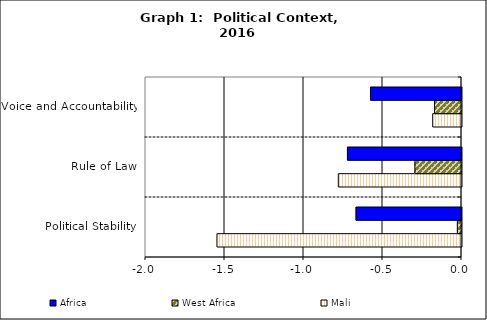
| Category | Mali | West Africa | Africa |
|---|---|---|---|
| Political Stability | -1.548 | -0.026 | -0.667 |
| Rule of Law | -0.78 | -0.295 | -0.722 |
| Voice and Accountability | -0.182 | -0.171 | -0.576 |